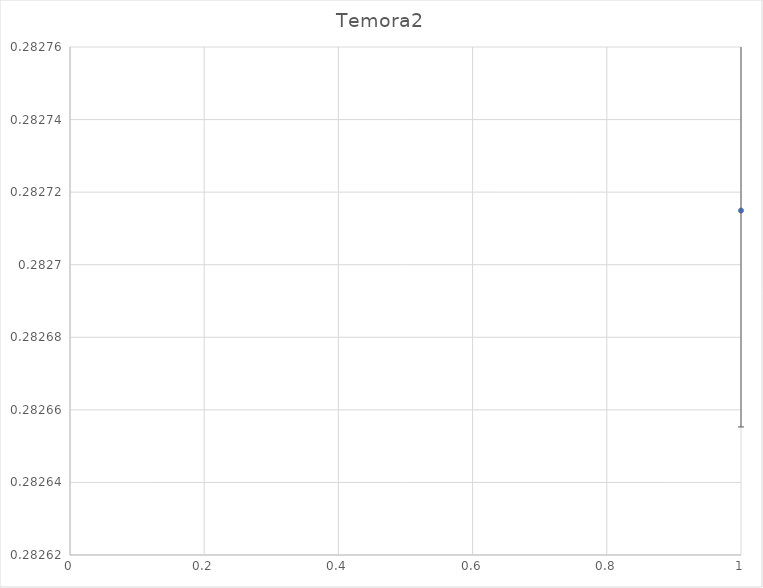
| Category | Series 0 |
|---|---|
| 0 | 0.283 |
| 1 | 0.283 |
| 2 | 0.283 |
| 3 | 0.283 |
| 4 | 0.283 |
| 5 | 0.283 |
| 6 | 0.283 |
| 7 | 0.283 |
| 8 | 0.283 |
| 9 | 0.283 |
| 10 | 0.283 |
| 11 | 0.283 |
| 12 | 0.283 |
| 13 | 0.283 |
| 14 | 0.283 |
| 15 | 0.283 |
| 16 | 0.283 |
| 17 | 0.283 |
| 18 | 0.283 |
| 19 | 0.283 |
| 20 | 0.283 |
| 21 | 0.283 |
| 22 | 0.283 |
| 23 | 0.283 |
| 24 | 0.283 |
| 25 | 0.283 |
| 26 | 0.283 |
| 27 | 0.283 |
| 28 | 0.283 |
| 29 | 0.283 |
| 30 | 0.283 |
| 31 | 0.283 |
| 32 | 0.283 |
| 33 | 0.283 |
| 34 | 0.283 |
| 35 | 0.283 |
| 36 | 0.283 |
| 37 | 0.283 |
| 38 | 0.283 |
| 39 | 0.283 |
| 40 | 0.283 |
| 41 | 0.283 |
| 42 | 0.283 |
| 43 | 0.283 |
| 44 | 0.283 |
| 45 | 0.283 |
| 46 | 0.283 |
| 47 | 0.283 |
| 48 | 0.283 |
| 49 | 0.283 |
| 50 | 0.283 |
| 51 | 0.283 |
| 52 | 0.283 |
| 53 | 0.283 |
| 54 | 0.283 |
| 55 | 0.283 |
| 56 | 0.283 |
| 57 | 0.283 |
| 58 | 0.283 |
| 59 | 0.283 |
| 60 | 0.283 |
| 61 | 0.283 |
| 62 | 0.283 |
| 63 | 0.283 |
| 64 | 0.283 |
| 65 | 0.283 |